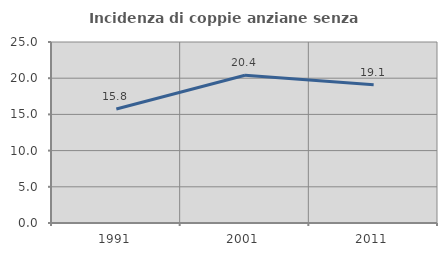
| Category | Incidenza di coppie anziane senza figli  |
|---|---|
| 1991.0 | 15.753 |
| 2001.0 | 20.408 |
| 2011.0 | 19.104 |